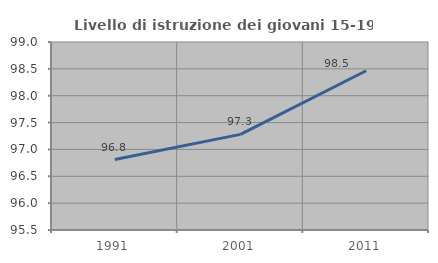
| Category | Livello di istruzione dei giovani 15-19 anni |
|---|---|
| 1991.0 | 96.812 |
| 2001.0 | 97.28 |
| 2011.0 | 98.464 |